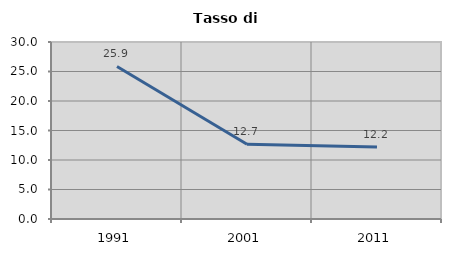
| Category | Tasso di disoccupazione   |
|---|---|
| 1991.0 | 25.86 |
| 2001.0 | 12.675 |
| 2011.0 | 12.185 |